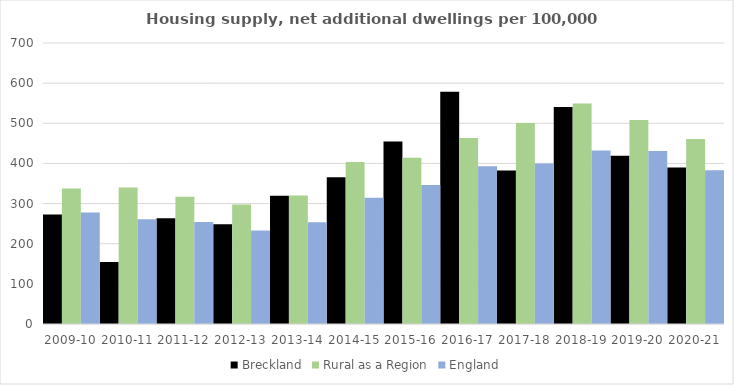
| Category | Breckland | Rural as a Region | England |
|---|---|---|---|
| 2009-10 | 272.964 | 337.852 | 277.548 |
| 2010-11 | 154.158 | 340.105 | 260.994 |
| 2011-12 | 263.341 | 317.04 | 254.007 |
| 2012-13 | 248.754 | 297.763 | 233.153 |
| 2013-14 | 319.561 | 319.835 | 253.602 |
| 2014-15 | 365.635 | 403.796 | 314.256 |
| 2015-16 | 454.686 | 414.091 | 346.154 |
| 2016-17 | 578.313 | 463.209 | 393.256 |
| 2017-18 | 382.39 | 500.68 | 399.646 |
| 2018-19 | 540.447 | 549.491 | 432.099 |
| 2019-20 | 419.382 | 508.493 | 431.187 |
| 2020-21 | 390.075 | 461.114 | 382.827 |